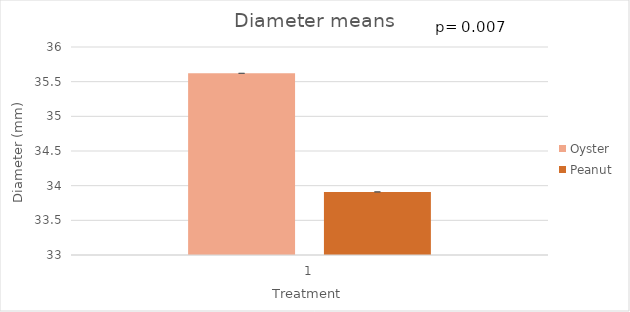
| Category | Oyster | Peanut |
|---|---|---|
| 0 | 35.62 | 33.91 |